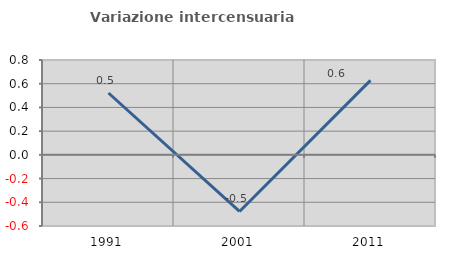
| Category | Variazione intercensuaria annua |
|---|---|
| 1991.0 | 0.522 |
| 2001.0 | -0.477 |
| 2011.0 | 0.628 |